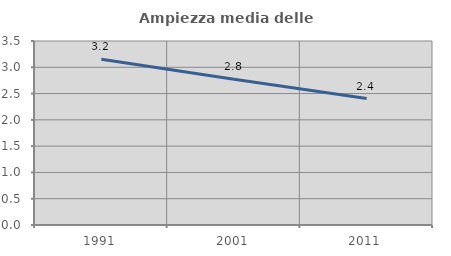
| Category | Ampiezza media delle famiglie |
|---|---|
| 1991.0 | 3.152 |
| 2001.0 | 2.773 |
| 2011.0 | 2.404 |